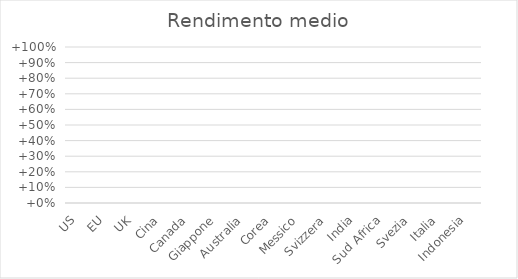
| Category | Rendimento medio |
|---|---|
| US | 0 |
| EU | 0 |
| UK | 0 |
| Cina | 0 |
| Canada | 0 |
| Giappone | 0 |
| Australia | 0 |
| Corea | 0 |
| Messico | 0 |
| Svizzera | 0 |
| India | 0 |
| Sud Africa | 0 |
| Svezia | 0 |
| Italia | 0 |
| Indonesia | 0 |